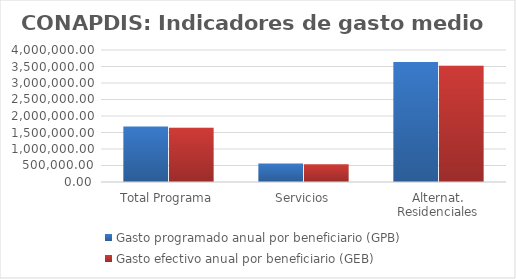
| Category | Gasto programado anual por beneficiario (GPB)  | Gasto efectivo anual por beneficiario (GEB)  |
|---|---|---|
| Total Programa | 1682473.912 | 1641935.762 |
| Servicios | 563759.08 | 536815.447 |
| Alternat. Residenciales | 3633720.711 | 3519534.326 |